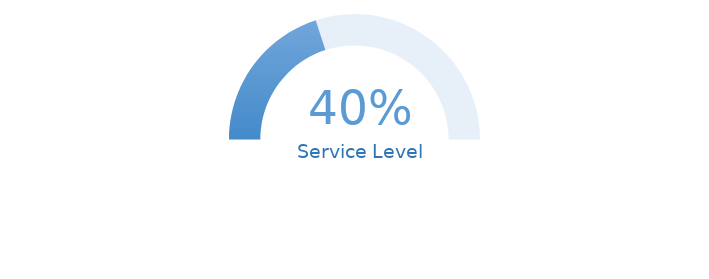
| Category | Service Level |
|---|---|
| 0 | 0.4 |
| 1 | 0.6 |
| 2 | 1 |